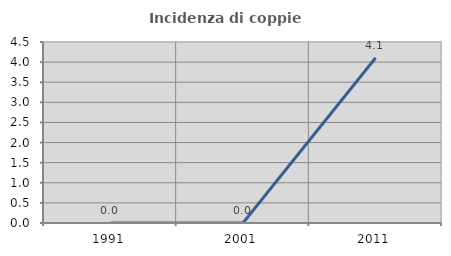
| Category | Incidenza di coppie miste |
|---|---|
| 1991.0 | 0 |
| 2001.0 | 0 |
| 2011.0 | 4.11 |